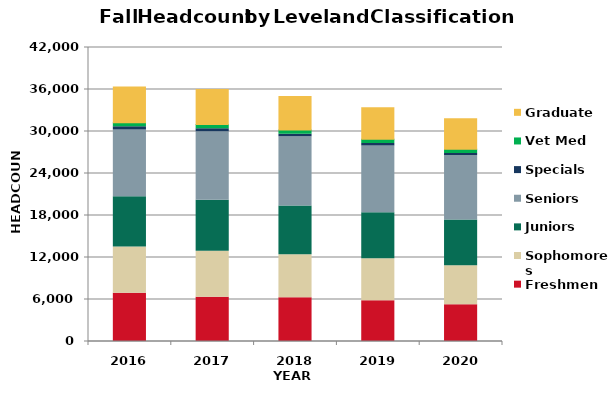
| Category | Freshmen | Sophomores | Juniors | Seniors | Specials | Vet Med | Graduate |
|---|---|---|---|---|---|---|---|
| 2016.0 | 6879 | 6611 | 7187 | 9547 | 447 | 586 | 5096 |
| 2017.0 | 6319 | 6557 | 7291 | 9790 | 449 | 596 | 4991 |
| 2018.0 | 6249 | 6157 | 6936 | 9906 | 373 | 597 | 4774 |
| 2019.0 | 5828 | 5984 | 6565 | 9553 | 364 | 599 | 4498 |
| 2020.0 | 5240 | 5590 | 6540 | 9197 | 279 | 627 | 4352 |